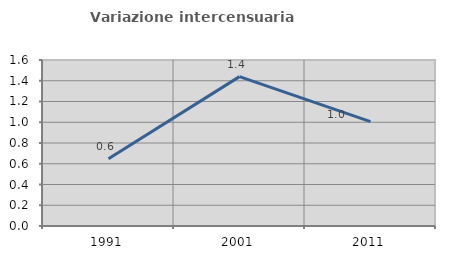
| Category | Variazione intercensuaria annua |
|---|---|
| 1991.0 | 0.648 |
| 2001.0 | 1.44 |
| 2011.0 | 1.006 |